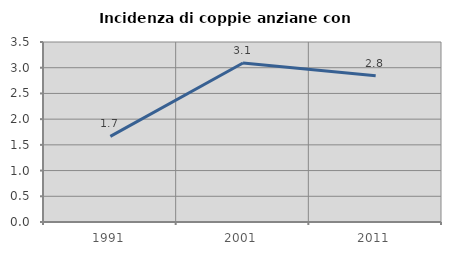
| Category | Incidenza di coppie anziane con figli |
|---|---|
| 1991.0 | 1.665 |
| 2001.0 | 3.092 |
| 2011.0 | 2.842 |